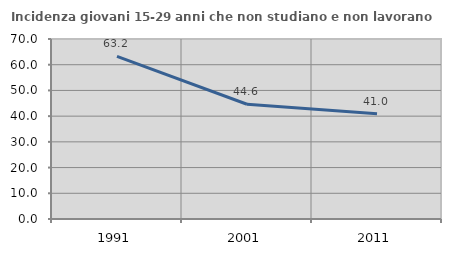
| Category | Incidenza giovani 15-29 anni che non studiano e non lavorano  |
|---|---|
| 1991.0 | 63.232 |
| 2001.0 | 44.615 |
| 2011.0 | 40.952 |